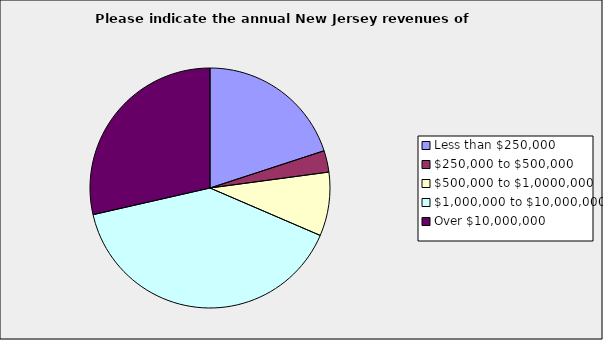
| Category | Series 0 |
|---|---|
| Less than $250,000 | 0.2 |
| $250,000 to $500,000 | 0.029 |
| $500,000 to $1,0000,000 | 0.086 |
| $1,000,000 to $10,000,000 | 0.4 |
| Over $10,000,000 | 0.286 |